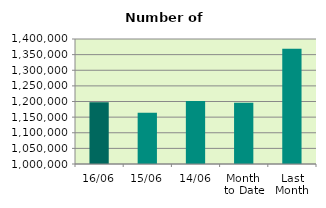
| Category | Series 0 |
|---|---|
| 16/06 | 1197704 |
| 15/06 | 1163884 |
| 14/06 | 1201344 |
| Month 
to Date | 1195699.833 |
| Last
Month | 1368600.286 |